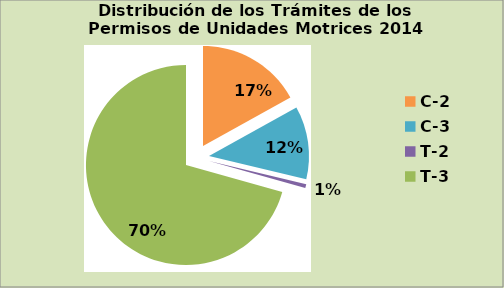
| Category | Series 0 |
|---|---|
| C-2 | 16.871 |
| C-3 | 11.786 |
| T-2 | 0.623 |
| T-3 | 70.435 |